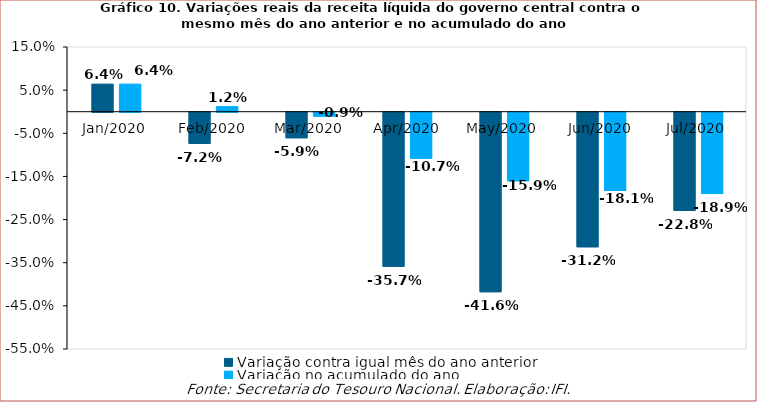
| Category | Variação contra igual mês do ano anterior | Variação no acumulado do ano |
|---|---|---|
| 2020-01-01 | 0.064 | 0.064 |
| 2020-02-01 | -0.072 | 0.012 |
| 2020-03-01 | -0.059 | -0.009 |
| 2020-04-01 | -0.357 | -0.107 |
| 2020-05-01 | -0.416 | -0.159 |
| 2020-06-01 | -0.312 | -0.181 |
| 2020-07-01 | -0.228 | -0.189 |